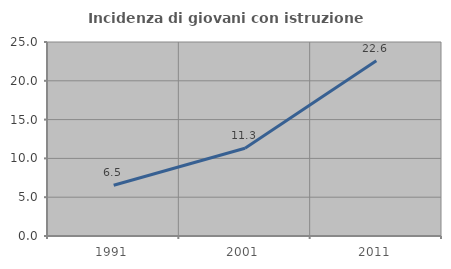
| Category | Incidenza di giovani con istruzione universitaria |
|---|---|
| 1991.0 | 6.542 |
| 2001.0 | 11.304 |
| 2011.0 | 22.594 |